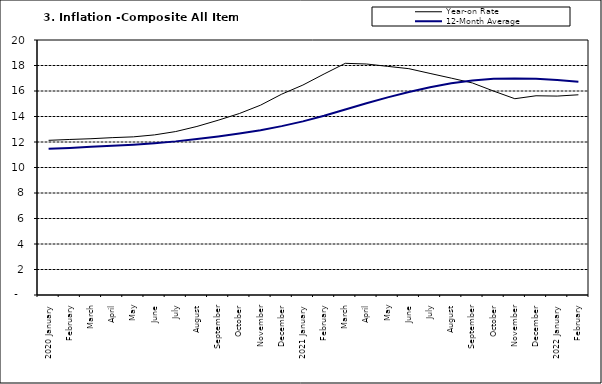
| Category | Year-on Rate | 12-Month Average |
|---|---|---|
| 2020 January | 12.132 | 11.462 |
| February | 12.199 | 11.539 |
| March | 12.257 | 11.624 |
| April | 12.341 | 11.706 |
| May | 12.404 | 11.791 |
| June | 12.559 | 11.904 |
| July | 12.821 | 12.049 |
| August | 13.22 | 12.233 |
| September | 13.707 | 12.44 |
| October | 14.233 | 12.664 |
| November | 14.887 | 12.923 |
| December | 15.753 | 13.246 |
| 2021 January | 16.466 | 13.616 |
| February | 17.335 | 14.053 |
| March | 18.171 | 14.554 |
| April | 18.117 | 15.039 |
| May | 17.933 | 15.499 |
| June | 17.751 | 15.927 |
| July | 17.377 | 16.298 |
| August | 17.009 | 16.601 |
| September | 16.63 | 16.83 |
| October | 15.994 | 16.958 |
| November | 15.396 | 16.979 |
| December | 15.625 | 16.953 |
| 2022 January | 15.601 | 16.869 |
| February | 15.702 | 16.728 |